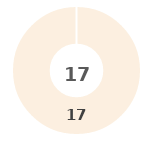
| Category | Series 0 |
|---|---|
| 0 | 0 |
| 1 | 0 |
| 2 | 0 |
| 3 | 0 |
| 4 | 17 |